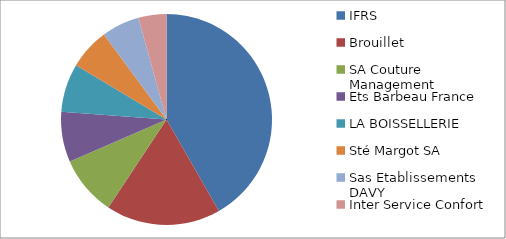
| Category | Series 0 |
|---|---|
| IFRS | 0.417 |
| Brouillet | 0.176 |
| SA Couture Management | 0.092 |
| Ets Barbeau France | 0.077 |
| LA BOISSELLERIE | 0.075 |
| Sté Margot SA | 0.063 |
| Sas Etablissements DAVY | 0.058 |
| Inter Service Confort | 0.043 |